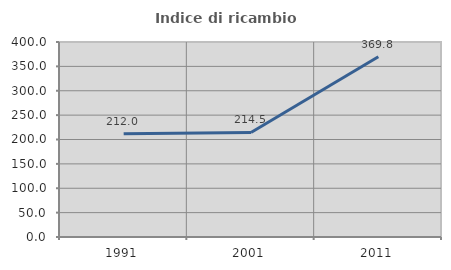
| Category | Indice di ricambio occupazionale  |
|---|---|
| 1991.0 | 212.037 |
| 2001.0 | 214.516 |
| 2011.0 | 369.811 |